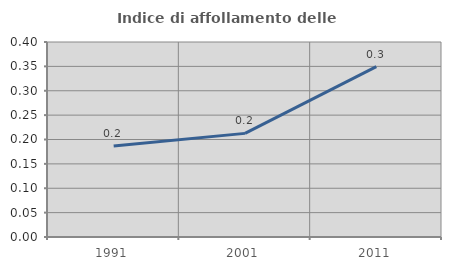
| Category | Indice di affollamento delle abitazioni  |
|---|---|
| 1991.0 | 0.187 |
| 2001.0 | 0.213 |
| 2011.0 | 0.35 |